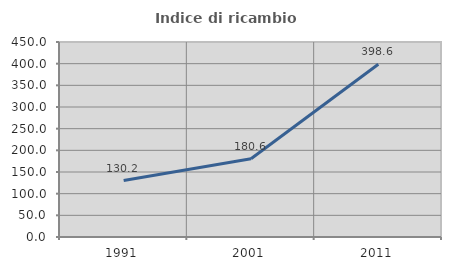
| Category | Indice di ricambio occupazionale  |
|---|---|
| 1991.0 | 130.189 |
| 2001.0 | 180.612 |
| 2011.0 | 398.551 |